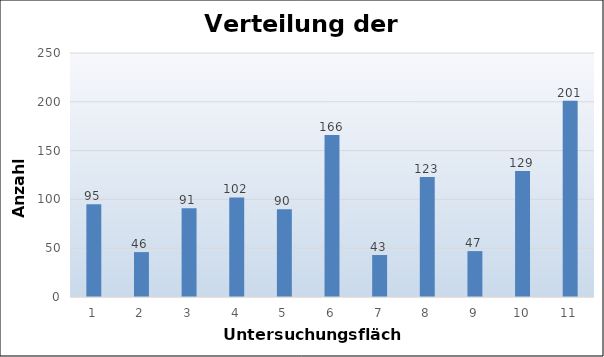
| Category | Series 0 |
|---|---|
| 0 | 95 |
| 1 | 46 |
| 2 | 91 |
| 3 | 102 |
| 4 | 90 |
| 5 | 166 |
| 6 | 43 |
| 7 | 123 |
| 8 | 47 |
| 9 | 129 |
| 10 | 201 |